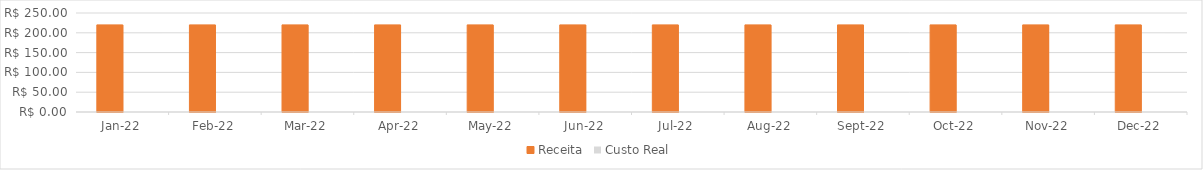
| Category | Receita | Custo Real |
|---|---|---|
| 2022-01-01 | 220 | 0 |
| 2022-02-01 | 220 | 0 |
| 2022-03-01 | 220 | 0 |
| 2022-04-01 | 220 | 0 |
| 2022-05-01 | 220 | 0 |
| 2022-06-01 | 220 | 0 |
| 2022-07-01 | 220 | 0 |
| 2022-08-01 | 220 | 0 |
| 2022-09-01 | 220 | 0 |
| 2022-10-01 | 220 | 0 |
| 2022-11-01 | 220 | 0 |
| 2022-12-01 | 220 | 0 |